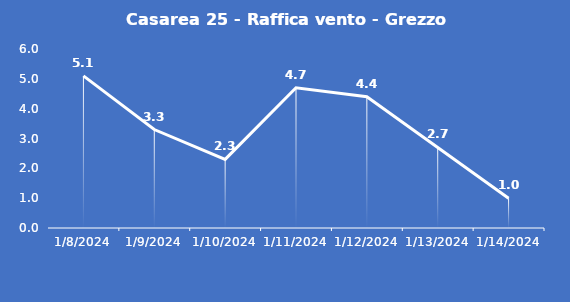
| Category | Casarea 25 - Raffica vento - Grezzo (m/s) |
|---|---|
| 1/8/24 | 5.1 |
| 1/9/24 | 3.3 |
| 1/10/24 | 2.3 |
| 1/11/24 | 4.7 |
| 1/12/24 | 4.4 |
| 1/13/24 | 2.7 |
| 1/14/24 | 1 |